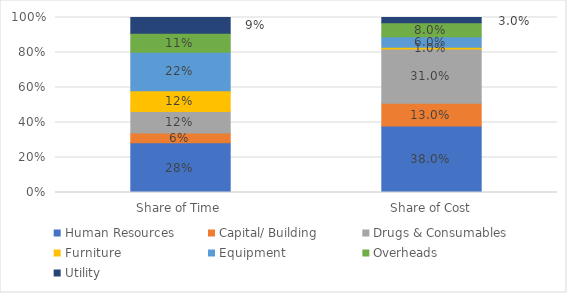
| Category | Human Resources | Capital/ Building | Drugs & Consumables | Furniture | Equipment | Overheads | Utility |
|---|---|---|---|---|---|---|---|
| Share of Time | 0.284 | 0.056 | 0.123 | 0.119 | 0.219 | 0.109 | 0.09 |
| Share of Cost | 0.38 | 0.13 | 0.31 | 0.01 | 0.06 | 0.08 | 0.03 |